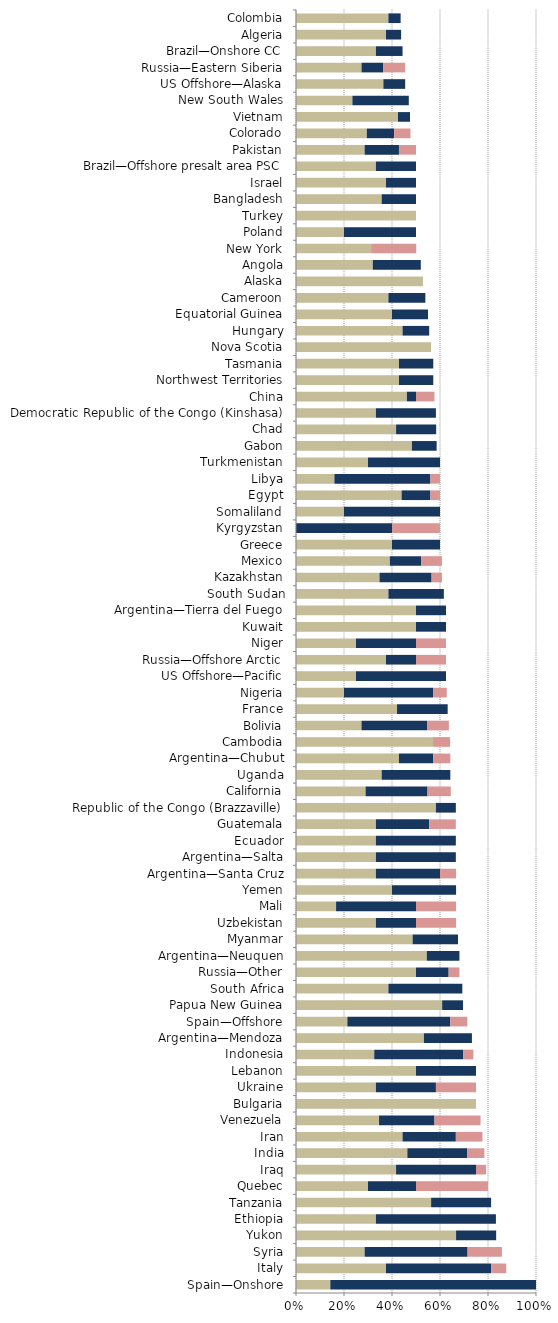
| Category |   Mild deterrent to investment |   Strong deterrent to investment |   Would not pursue investment due to this factor |
|---|---|---|---|
| Spain—Onshore | 0.143 | 0.857 | 0 |
| Italy | 0.375 | 0.438 | 0.063 |
| Syria | 0.286 | 0.429 | 0.143 |
| Yukon | 0.667 | 0.167 | 0 |
| Ethiopia | 0.333 | 0.5 | 0 |
| Tanzania | 0.563 | 0.25 | 0 |
| Quebec | 0.3 | 0.2 | 0.3 |
| Iraq | 0.417 | 0.333 | 0.042 |
| India | 0.464 | 0.25 | 0.071 |
| Iran | 0.444 | 0.222 | 0.111 |
| Venezuela | 0.346 | 0.231 | 0.192 |
| Bulgaria | 0.75 | 0 | 0 |
| Ukraine | 0.333 | 0.25 | 0.167 |
| Lebanon | 0.5 | 0.25 | 0 |
| Indonesia | 0.326 | 0.37 | 0.043 |
| Argentina—Mendoza | 0.533 | 0.2 | 0 |
| Spain—Offshore | 0.214 | 0.429 | 0.071 |
| Papua New Guinea | 0.609 | 0.087 | 0 |
| South Africa | 0.385 | 0.308 | 0 |
| Russia—Other | 0.5 | 0.136 | 0.045 |
| Argentina—Neuquen | 0.545 | 0.136 | 0 |
| Myanmar | 0.486 | 0.189 | 0 |
| Uzbekistan | 0.333 | 0.167 | 0.167 |
| Mali | 0.167 | 0.333 | 0.167 |
| Yemen | 0.4 | 0.267 | 0 |
| Argentina—Santa Cruz | 0.333 | 0.267 | 0.067 |
| Argentina—Salta | 0.333 | 0.333 | 0 |
| Ecuador | 0.333 | 0.333 | 0 |
| Guatemala | 0.333 | 0.222 | 0.111 |
| Republic of the Congo (Brazzaville) | 0.583 | 0.083 | 0 |
| California | 0.29 | 0.258 | 0.097 |
| Uganda | 0.357 | 0.286 | 0 |
| Argentina—Chubut | 0.429 | 0.143 | 0.071 |
| Cambodia | 0.571 | 0 | 0.071 |
| Bolivia | 0.273 | 0.273 | 0.091 |
| France | 0.421 | 0.211 | 0 |
| Nigeria | 0.2 | 0.371 | 0.057 |
| US Offshore—Pacific | 0.25 | 0.375 | 0 |
| Russia—Offshore Arctic | 0.375 | 0.125 | 0.125 |
| Niger | 0.25 | 0.25 | 0.125 |
| Kuwait | 0.5 | 0.125 | 0 |
| Argentina—Tierra del Fuego | 0.5 | 0.125 | 0 |
| South Sudan | 0.385 | 0.231 | 0 |
| Kazakhstan | 0.348 | 0.217 | 0.043 |
| Mexico | 0.391 | 0.13 | 0.087 |
| Greece | 0.4 | 0.2 | 0 |
| Kyrgyzstan | 0 | 0.4 | 0.2 |
| Somaliland | 0.2 | 0.4 | 0 |
| Egypt | 0.44 | 0.12 | 0.04 |
| Libya | 0.16 | 0.4 | 0.04 |
| Turkmenistan | 0.3 | 0.3 | 0 |
| Gabon | 0.483 | 0.103 | 0 |
| Chad | 0.417 | 0.167 | 0 |
| Democratic Republic of the Congo (Kinshasa) | 0.333 | 0.25 | 0 |
| China | 0.462 | 0.038 | 0.077 |
| Northwest Territories | 0.429 | 0.143 | 0 |
| Tasmania | 0.429 | 0.143 | 0 |
| Nova Scotia | 0.563 | 0 | 0 |
| Hungary | 0.444 | 0.111 | 0 |
| Equatorial Guinea | 0.4 | 0.15 | 0 |
| Cameroon | 0.385 | 0.154 | 0 |
| Alaska | 0.529 | 0 | 0 |
| Angola | 0.32 | 0.2 | 0 |
| New York | 0.313 | 0 | 0.188 |
| Poland | 0.2 | 0.3 | 0 |
| Turkey | 0.5 | 0 | 0 |
| Bangladesh | 0.357 | 0.143 | 0 |
| Israel | 0.375 | 0.125 | 0 |
| Brazil—Offshore presalt area PSC | 0.333 | 0.167 | 0 |
| Pakistan | 0.286 | 0.143 | 0.071 |
| Colorado | 0.295 | 0.114 | 0.068 |
| Vietnam | 0.425 | 0.05 | 0 |
| New South Wales | 0.235 | 0.235 | 0 |
| US Offshore—Alaska | 0.364 | 0.091 | 0 |
| Russia—Eastern Siberia | 0.273 | 0.091 | 0.091 |
| Brazil—Onshore CC | 0.333 | 0.111 | 0 |
| Algeria | 0.375 | 0.063 | 0 |
| Colombia | 0.385 | 0.051 | 0 |